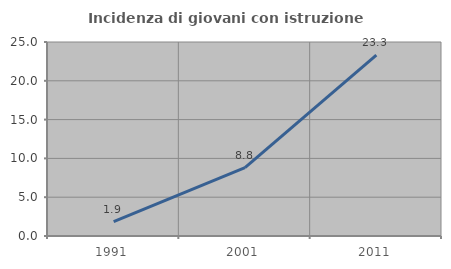
| Category | Incidenza di giovani con istruzione universitaria |
|---|---|
| 1991.0 | 1.865 |
| 2001.0 | 8.815 |
| 2011.0 | 23.311 |